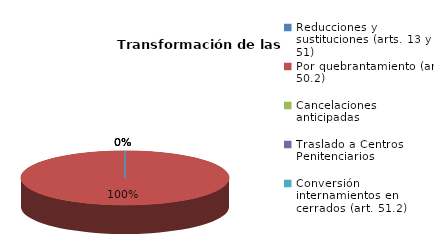
| Category | Series 0 |
|---|---|
| Reducciones y sustituciones (arts. 13 y 51) | 0 |
| Por quebrantamiento (art. 50.2) | 1 |
| Cancelaciones anticipadas | 0 |
| Traslado a Centros Penitenciarios | 0 |
| Conversión internamientos en cerrados (art. 51.2) | 0 |